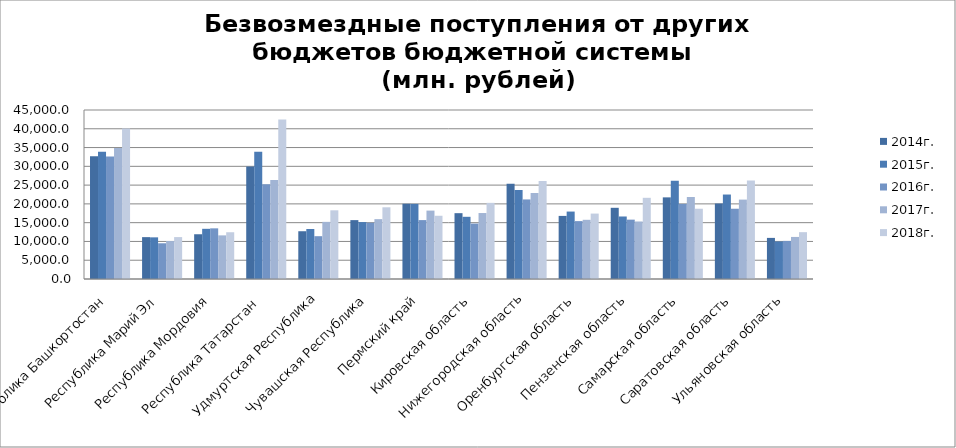
| Category | 2013г. | 2014г. | 2015г. | 2016г. | 2017г. | 2018г. |
|---|---|---|---|---|---|---|
| Республика Башкортостан |  | 32717.599 | 33902.425 | 32632.842 | 34877.361 | 40052.293 |
| Республика Марий Эл |  | 11146.973 | 11090.301 | 9513.04 | 10103.008 | 11159.606 |
| Республика Мордовия |  | 11915.617 | 13364.459 | 13488.181 | 11617.006 | 12450.907 |
| Республика Татарстан  |  | 29959.805 | 33887.439 | 25261.732 | 26334.839 | 42439.939 |
| Удмуртская Республика |  | 12719.999 | 13311.896 | 11398.875 | 15212.676 | 18290.639 |
| Чувашская Республика |  | 15677.635 | 15156.979 | 14980.884 | 15935.859 | 19090.723 |
| Пермский край |  | 20040.371 | 20001.927 | 15685.097 | 18213.467 | 16839.184 |
| Кировская область |  | 17528.08 | 16561.403 | 14757.838 | 17565.505 | 20273.827 |
| Нижегородская область |  | 25370.054 | 23689.888 | 21185.534 | 22925.203 | 26074.572 |
| Оренбургская область |  | 16801.104 | 17958.12 | 15413.427 | 15763.93 | 17417.569 |
| Пензенская область |  | 18957.906 | 16644.647 | 15805.464 | 15314.557 | 21618.76 |
| Самарская область |  | 21735.669 | 26157.655 | 19992.547 | 21830.653 | 18709.651 |
| Саратовская область |  | 20108.244 | 22492.29 | 18710.019 | 21142.238 | 26218.648 |
| Ульяновская область |  | 10945.759 | 10003.655 | 10136.008 | 11200.178 | 12471.361 |